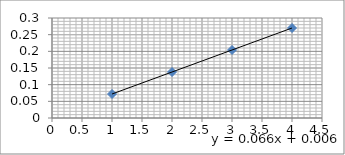
| Category | Series 0 |
|---|---|
| 1.0 | 0.072 |
| 2.0 | 0.138 |
| 3.0 | 0.204 |
| 4.0 | 0.27 |